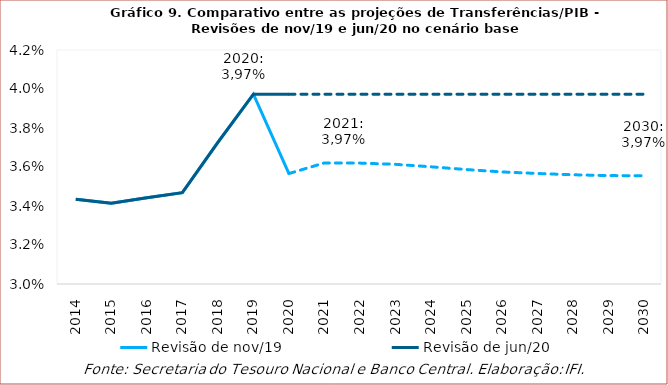
| Category | Revisão de nov/19 | Revisão de jun/20 |
|---|---|---|
| 2014.0 | 0.034 | 0.034 |
| 2015.0 | 0.034 | 0.034 |
| 2016.0 | 0.034 | 0.034 |
| 2017.0 | 0.035 | 0.035 |
| 2018.0 | 0.037 | 0.037 |
| 2019.0 | 0.04 | 0.04 |
| 2020.0 | 0.036 | 0.04 |
| 2021.0 | 0.036 | 0.04 |
| 2022.0 | 0.036 | 0.04 |
| 2023.0 | 0.036 | 0.04 |
| 2024.0 | 0.036 | 0.04 |
| 2025.0 | 0.036 | 0.04 |
| 2026.0 | 0.036 | 0.04 |
| 2027.0 | 0.036 | 0.04 |
| 2028.0 | 0.036 | 0.04 |
| 2029.0 | 0.036 | 0.04 |
| 2030.0 | 0.036 | 0.04 |